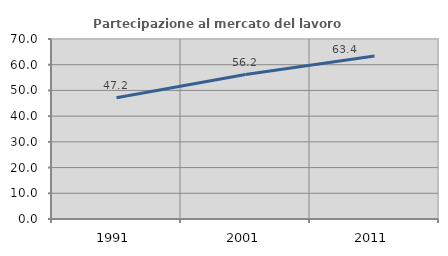
| Category | Partecipazione al mercato del lavoro  femminile |
|---|---|
| 1991.0 | 47.159 |
| 2001.0 | 56.155 |
| 2011.0 | 63.356 |